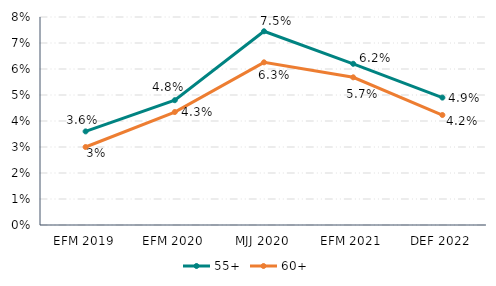
| Category | 55+ | 60+ |
|---|---|---|
| EFM 2019 | 0.036 | 0.03 |
| EFM 2020 | 0.048 | 0.043 |
| MJJ 2020 | 0.074 | 0.063 |
| EFM 2021 | 0.062 | 0.057 |
| DEF 2022 | 0.049 | 0.042 |